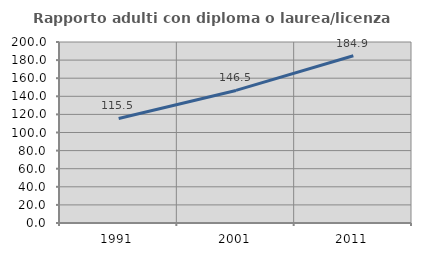
| Category | Rapporto adulti con diploma o laurea/licenza media  |
|---|---|
| 1991.0 | 115.535 |
| 2001.0 | 146.497 |
| 2011.0 | 184.872 |